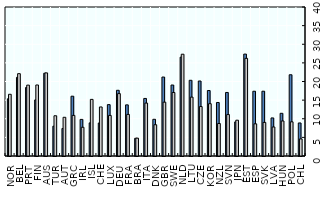
| Category | Large businesses | SMEs |
|---|---|---|
| NOR | 15.363 | 16.565 |
| BEL | 21.117 | 22.104 |
| PRT | 18.388 | 19.027 |
| FIN | 15.057 | 19.069 |
| AUS | 22.222 | 22.31 |
| TUR | 8.005 | 10.802 |
| AUT | 7.393 | 10.393 |
| GRC | 16.055 | 10.901 |
| IRL | 9.825 | 7.71 |
| ISL | 8.889 | 15.201 |
| CHE | 8.862 | 13.165 |
| LUX | 13.793 | 10.897 |
| DEU | 17.64 | 16.751 |
| FRA | 13.727 | 11.164 |
| BRA | 4.754 | 4.793 |
| ITA | 15.449 | 14.211 |
| DNK | 9.855 | 8.39 |
| GBR | 21.196 | 14.452 |
| SWE | 19.056 | 17.05 |
| NLD | 26.537 | 27.328 |
| LTU | 20.325 | 15.803 |
| CZE | 20.134 | 13.277 |
| KOR | 17.578 | 14.047 |
| NZL | 14.365 | 8.729 |
| SVN | 17.059 | 11.124 |
| JPN | 9.149 | 9.612 |
| EST | 27.358 | 26.22 |
| ESP | 17.387 | 8.637 |
| SVK | 17.391 | 9.018 |
| LVA | 10.219 | 7.786 |
| HUN | 11.46 | 9.402 |
| POL | 21.811 | 9.175 |
| CHL | 8.871 | 4.589 |